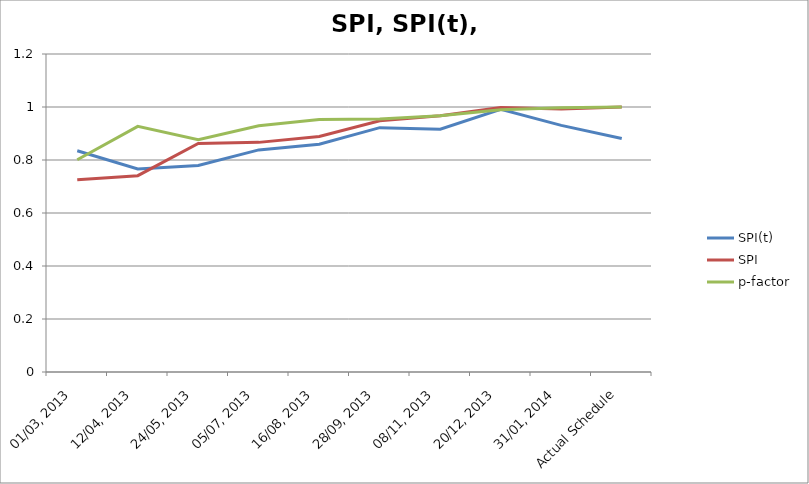
| Category | SPI(t) | SPI | p-factor |
|---|---|---|---|
| 01/03, 2013 | 0.835 | 0.725 | 0.801 |
| 12/04, 2013 | 0.766 | 0.741 | 0.927 |
| 24/05, 2013 | 0.779 | 0.862 | 0.877 |
| 05/07, 2013 | 0.838 | 0.867 | 0.929 |
| 16/08, 2013 | 0.859 | 0.889 | 0.953 |
| 28/09, 2013 | 0.922 | 0.948 | 0.955 |
| 08/11, 2013 | 0.916 | 0.967 | 0.967 |
| 20/12, 2013 | 0.991 | 0.998 | 0.99 |
| 31/01, 2014 | 0.931 | 0.992 | 0.997 |
| Actual Schedule | 0.881 | 1 | 1 |